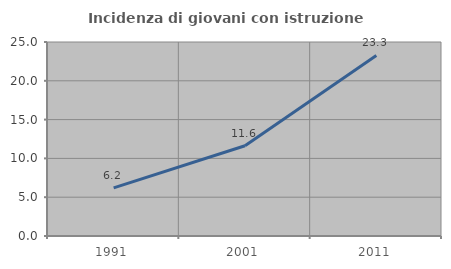
| Category | Incidenza di giovani con istruzione universitaria |
|---|---|
| 1991.0 | 6.199 |
| 2001.0 | 11.634 |
| 2011.0 | 23.268 |